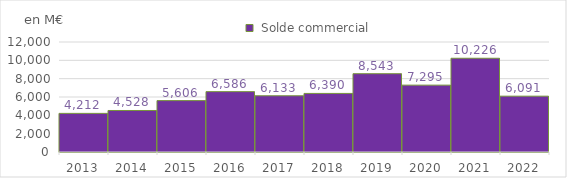
| Category |  Solde commercial |
|---|---|
| 2013 | 4212 |
| 2014 | 4528 |
| 2015 | 5606 |
| 2016 | 6586.094 |
| 2017 | 6133 |
| 2018 | 6390 |
| 2019 | 8542.891 |
| 2020 | 7294.5 |
| 2021 | 10226 |
| 2022 | 6091 |